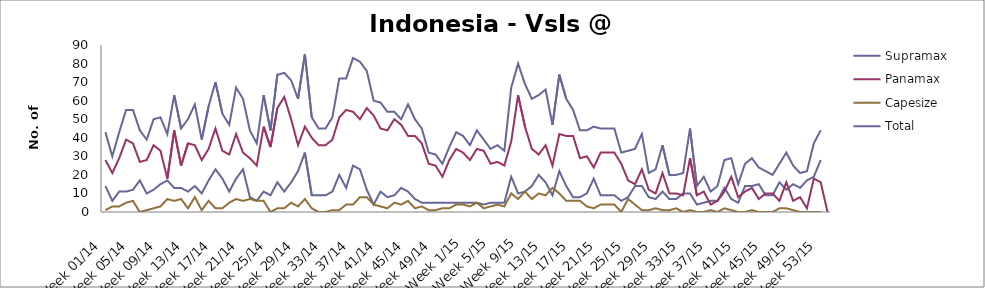
| Category | Supramax | Panamax | Capesize | Total |
|---|---|---|---|---|
| Week 01/14 | 14 | 28 | 1 | 43 |
| Week 02/14 | 6 | 21 | 3 | 30 |
| Week 03/14 | 11 | 29 | 3 | 43 |
| Week 04/14 | 11 | 39 | 5 | 55 |
| Week 05/14 | 12 | 37 | 6 | 55 |
| Week 06/14 | 17 | 27 | 0 | 44 |
| Week 07/14 | 10 | 28 | 1 | 39 |
| Week 08/14 | 12 | 36 | 2 | 50 |
| Week 09/14 | 15 | 33 | 3 | 51 |
| Week 10/14 | 17 | 18 | 7 | 42 |
| Week 11/14 | 13 | 44 | 6 | 63 |
| Week 12/14 | 13 | 25 | 7 | 45 |
| Week 13/14 | 11 | 37 | 2 | 50 |
| Week 14/14 | 14 | 36 | 8 | 58 |
| Week 15/14 | 10 | 28 | 1 | 39 |
| Week 16/14 | 17 | 34 | 6 | 57 |
| Week 17/14 | 23 | 45 | 2 | 70 |
| Week 18/14 | 18 | 33 | 2 | 53 |
| Week 19/14 | 11 | 31 | 5 | 47 |
| Week 20/14 | 18 | 42 | 7 | 67 |
| Week 21/14 | 23 | 32 | 6 | 61 |
| Week 22/14 | 8 | 29 | 7 | 44 |
| Week 23/14 | 6 | 25 | 6 | 37 |
| Week 24/14 | 11 | 46 | 6 | 63 |
| Week 25/14 | 9 | 35 | 0 | 44 |
| Week 26/14 | 16 | 56 | 2 | 74 |
| Week 27/14 | 11 | 62 | 2 | 75 |
| Week 28/14 | 16 | 50 | 5 | 71 |
| Week 29/14 | 22 | 36 | 3 | 61 |
| Week 30/14 | 32 | 46 | 7 | 85 |
| Week 31/14 | 9 | 40 | 2 | 51 |
| Week 32/14 | 9 | 36 | 0 | 45 |
| Week 33/14 | 9 | 36 | 0 | 45 |
| Week 34/14 | 11 | 39 | 1 | 51 |
| Week 35/14 | 20 | 51 | 1 | 72 |
| Week 36/14 | 13 | 55 | 4 | 72 |
| Week 37/14 | 25 | 54 | 4 | 83 |
| Week 38/14 | 23 | 50 | 8 | 81 |
| Week 39/14 | 12 | 56 | 8 | 76 |
| Week 40/14 | 4 | 52 | 4 | 60 |
| Week 41/14 | 11 | 45 | 3 | 59 |
| Week 42/14 | 8 | 44 | 2 | 54 |
| Week 43/14 | 9 | 50 | 5 | 54 |
| Week 44/14 | 13 | 47 | 4 | 50 |
| Week 45/14 | 11 | 41 | 6 | 58 |
| Week 46/14 | 7 | 41 | 2 | 50 |
| Week 47/14 | 5 | 37 | 3 | 45 |
| Week 48/14 | 5 | 26 | 1 | 32 |
| Week 49/14 | 5 | 25 | 1 | 31 |
| Week 50/14 | 5 | 19 | 2 | 26 |
| Week 51/14 | 5 | 28 | 2 | 35 |
| Week 52/14 | 5 | 34 | 4 | 43 |
| Week 1/15 | 5 | 32 | 4 | 41 |
| Week 2/15 | 5 | 28 | 3 | 36 |
| Week 3/15 | 5 | 34 | 5 | 44 |
| Week 4/15 | 4 | 33 | 2 | 39 |
| Week 5/15 | 5 | 26 | 3 | 34 |
| Week 6/15 | 5 | 27 | 4 | 36 |
| Week 7/15 | 5 | 25 | 3 | 33 |
| Week 8/15 | 19 | 38 | 10 | 67 |
| Week 9/15 | 10 | 63 | 7 | 80 |
| Week 10/15 | 11 | 46 | 11 | 69 |
| Week 11/15 | 14 | 34 | 7 | 61 |
| Week 12/15 | 20 | 31 | 10 | 63 |
| Week 13/15 | 16 | 36 | 9 | 66 |
| Week 14/15 | 9 | 25 | 13 | 47 |
| Week 15/15 | 22 | 42 | 10 | 74 |
| Week 16/15 | 14 | 41 | 6 | 61 |
| Week 17/15 | 8 | 41 | 6 | 55 |
| Week 18/15 | 8 | 29 | 6 | 44 |
| Week 19/15 | 10 | 30 | 3 | 44 |
| Week 20/15 | 18 | 24 | 2 | 46 |
| Week 21/15 | 9 | 32 | 4 | 45 |
| Week 22/15 | 9 | 32 | 4 | 45 |
| Week 23/15 | 9 | 32 | 4 | 45 |
| Week 24/15 | 6 | 26 | 0 | 32 |
| Week 25/15 | 8 | 17 | 7 | 33 |
| Week 26/15 | 14 | 15 | 4 | 34 |
| Week 27/15 | 14 | 23 | 1 | 42 |
| Week 28/15 | 8 | 12 | 1 | 21 |
| Week 29/15 | 7 | 10 | 2 | 23 |
| Week 30/15 | 11 | 21 | 1 | 36 |
| Week 31/15 | 7 | 10 | 1 | 20 |
| Week 32/15 | 7 | 10 | 2 | 20 |
| Week 33/15 | 10 | 9 | 0 | 21 |
| Week 34/15 | 10 | 29 | 1 | 45 |
| Week 35/15 | 4 | 9 | 0 | 14 |
| Week 36/15 | 5 | 11 | 0 | 19 |
| Week 37/15 | 6 | 4 | 1 | 11 |
| Week 38/15 | 6 | 6 | 0 | 14 |
| Week 39/15 | 13 | 11 | 2 | 28 |
| Week 40/15 | 7 | 19 | 1 | 29 |
| Week 41/15 | 5 | 8 | 0 | 15 |
| Week 42/15 | 14 | 11 | 0 | 26 |
| Week 43/15 | 14 | 13 | 1 | 29 |
| Week 44/15 | 15 | 7 | 0 | 24 |
| Week 45/15 | 9 | 10 | 0 | 22 |
| Week 46/15 | 9 | 10 | 0 | 20 |
| Week 47/15 | 16 | 6 | 2 | 26 |
| Week 48/15 | 12 | 16 | 2 | 32 |
| Week 49/15 | 15 | 6 | 1 | 25 |
| Week 50/15 | 13 | 8 | 0 | 21 |
| Week 51/15 | 17 | 2 | 0 | 22 |
| Week 52/15 | 19 | 18 | 0 | 37 |
| Week 53/15 | 28 | 16 | 0 | 44 |